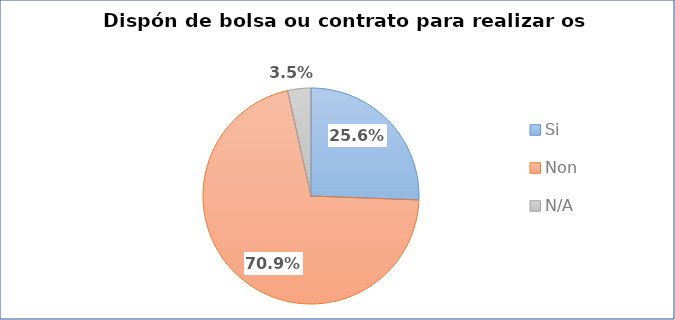
| Category | Si |
|---|---|
| Si | 0.256 |
| Non | 0.709 |
| N/A | 0.035 |